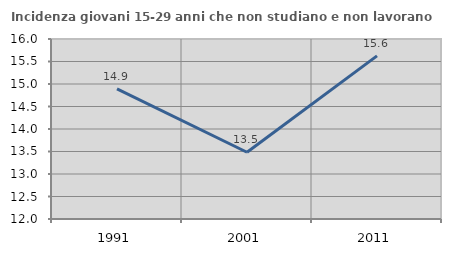
| Category | Incidenza giovani 15-29 anni che non studiano e non lavorano  |
|---|---|
| 1991.0 | 14.894 |
| 2001.0 | 13.483 |
| 2011.0 | 15.625 |